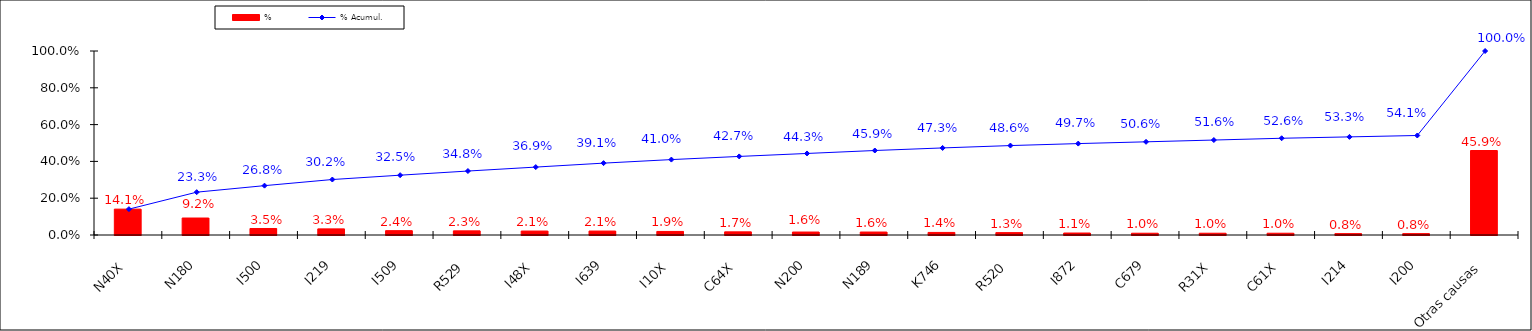
| Category | % |
|---|---|
| N40X | 0.141 |
| N180 | 0.092 |
| I500 | 0.035 |
| I219 | 0.033 |
| I509 | 0.024 |
| R529 | 0.023 |
| I48X | 0.021 |
| I639 | 0.021 |
| I10X | 0.019 |
| C64X | 0.017 |
| N200 | 0.016 |
| N189 | 0.016 |
| K746 | 0.014 |
| R520 | 0.013 |
| I872 | 0.011 |
| C679 | 0.01 |
| R31X | 0.01 |
| C61X | 0.01 |
| I214 | 0.008 |
| I200 | 0.008 |
| Otras causas | 0.459 |